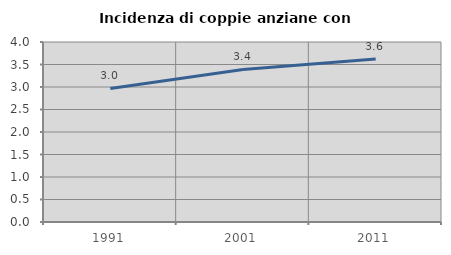
| Category | Incidenza di coppie anziane con figli |
|---|---|
| 1991.0 | 2.968 |
| 2001.0 | 3.389 |
| 2011.0 | 3.621 |